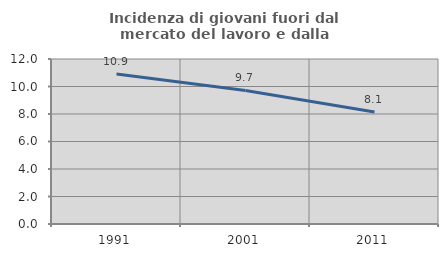
| Category | Incidenza di giovani fuori dal mercato del lavoro e dalla formazione  |
|---|---|
| 1991.0 | 10.917 |
| 2001.0 | 9.714 |
| 2011.0 | 8.148 |